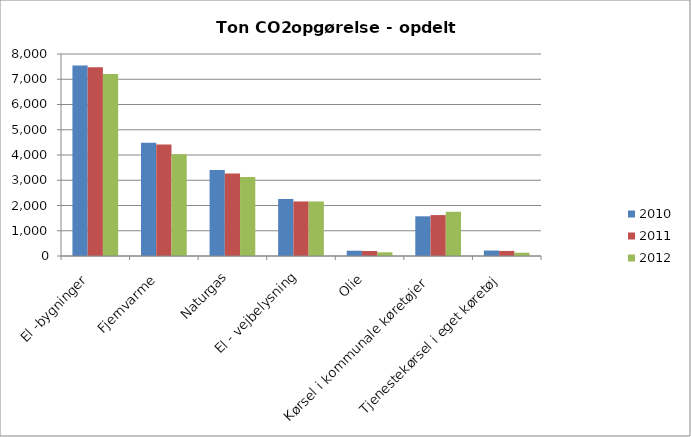
| Category | 2010 | 2011 | 2012 |
|---|---|---|---|
| El -bygninger  | 7546 | 7477 | 7206 |
| Fjernvarme  | 4485 | 4414 | 4025 |
| Naturgas  | 3401 | 3264 | 3130 |
| El - vejbelysning  | 2257 | 2160 | 2159 |
| Olie  | 209 | 198 | 147 |
| Kørsel i kommunale køretøjer   | 1572 | 1620 | 1751 |
| Tjenestekørsel i eget køretøj  | 216 | 201 | 130 |